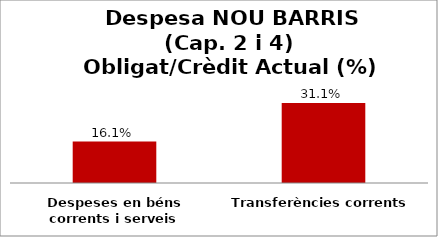
| Category | Series 0 |
|---|---|
| Despeses en béns corrents i serveis | 0.161 |
| Transferències corrents | 0.311 |